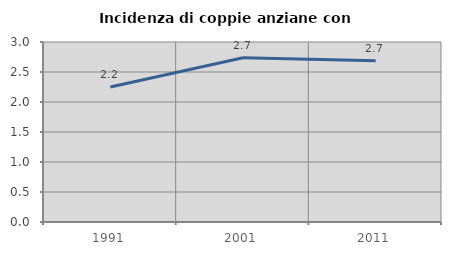
| Category | Incidenza di coppie anziane con figli |
|---|---|
| 1991.0 | 2.249 |
| 2001.0 | 2.738 |
| 2011.0 | 2.687 |